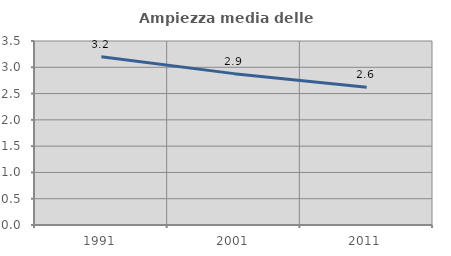
| Category | Ampiezza media delle famiglie |
|---|---|
| 1991.0 | 3.202 |
| 2001.0 | 2.879 |
| 2011.0 | 2.62 |